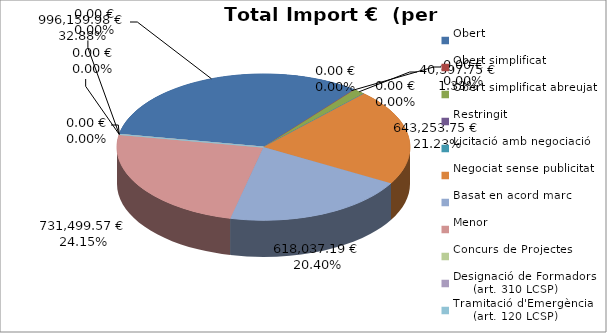
| Category | Total preu
(amb IVA) |
|---|---|
| Obert | 996159.98 |
| Obert simplificat | 0 |
| Obert simplificat abreujat | 40397.75 |
| Restringit | 0 |
| Licitació amb negociació | 0 |
| Negociat sense publicitat | 643253.75 |
| Basat en acord marc | 618037.19 |
| Menor | 731499.57 |
| Concurs de Projectes | 0 |
| Designació de Formadors
     (art. 310 LCSP) | 0 |
| Tramitació d'Emergència
     (art. 120 LCSP) | 0 |